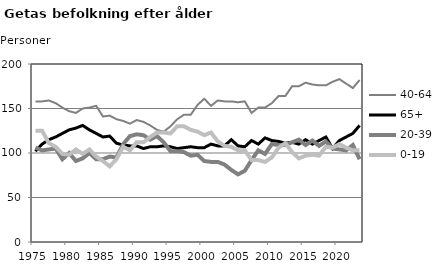
| Category | 40-64 | 65+ | 20-39 | 0-19 |
|---|---|---|---|---|
| 1975.0 | 158 | 102 | 106 | 125 |
| 1976.0 | 158 | 110 | 103 | 125 |
| 1977.0 | 159 | 115 | 104 | 111 |
| 1978.0 | 156 | 118 | 105 | 107 |
| 1979.0 | 151 | 122 | 93 | 99 |
| 1980.0 | 147 | 126 | 100 | 98 |
| 1981.0 | 145 | 128 | 91 | 104 |
| 1982.0 | 150 | 131 | 94 | 99 |
| 1983.0 | 151 | 126 | 100 | 104 |
| 1984.0 | 153 | 122 | 93 | 96 |
| 1985.0 | 141 | 118 | 93 | 91 |
| 1986.0 | 142 | 119 | 96 | 85 |
| 1987.0 | 138 | 111 | 95 | 93 |
| 1988.0 | 136 | 109 | 110 | 107 |
| 1989.0 | 133 | 108 | 119 | 103 |
| 1990.0 | 137 | 108 | 121 | 112 |
| 1991.0 | 135 | 105 | 120 | 112 |
| 1992.0 | 131 | 107 | 115 | 118 |
| 1993.0 | 126 | 107 | 119 | 123 |
| 1994.0 | 124 | 108 | 112 | 123 |
| 1995.0 | 130 | 107 | 102 | 122 |
| 1996.0 | 138 | 105 | 102 | 130 |
| 1997.0 | 143 | 106 | 101 | 130 |
| 1998.0 | 143 | 107 | 97 | 126 |
| 1999.0 | 154 | 106 | 98 | 124 |
| 2000.0 | 161 | 106 | 91 | 120 |
| 2001.0 | 153 | 110 | 90 | 123 |
| 2002.0 | 159 | 108 | 90 | 113 |
| 2003.0 | 158 | 108 | 87 | 108 |
| 2004.0 | 158 | 115 | 81 | 107 |
| 2005.0 | 157 | 108 | 76 | 103 |
| 2006.0 | 158 | 107 | 80 | 103 |
| 2007.0 | 145 | 114 | 92 | 92 |
| 2008.0 | 151 | 110 | 103 | 92 |
| 2009.0 | 151 | 117 | 99 | 90 |
| 2010.0 | 156 | 114 | 110 | 95 |
| 2011.0 | 164 | 113 | 109 | 106 |
| 2012.0 | 164 | 111 | 109 | 111 |
| 2013.0 | 175 | 112 | 112 | 101 |
| 2014.0 | 175 | 110 | 115 | 94 |
| 2015.0 | 179 | 115 | 109 | 97 |
| 2016.0 | 177 | 110 | 114 | 98 |
| 2017.0 | 176 | 114 | 108 | 97 |
| 2018.0 | 176 | 118 | 113 | 107 |
| 2019.0 | 180 | 105 | 105 | 106 |
| 2020.0 | 183 | 114 | 104 | 110 |
| 2021.0 | 178 | 118 | 103 | 106 |
| 2022.0 | 173 | 122 | 109 | 103 |
| 2023.0 | 182 | 131 | 93 | 103 |